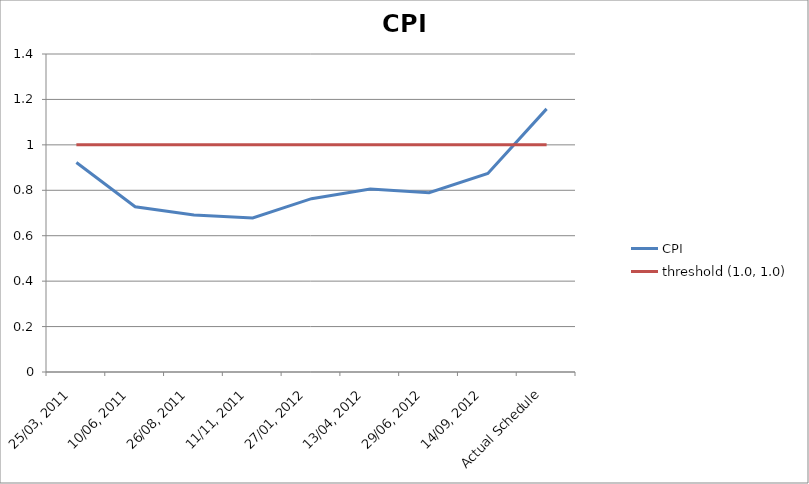
| Category | CPI | threshold (1.0, 1.0) |
|---|---|---|
| 25/03, 2011 | 0.922 | 1 |
| 10/06, 2011 | 0.728 | 1 |
| 26/08, 2011 | 0.691 | 1 |
| 11/11, 2011 | 0.678 | 1 |
| 27/01, 2012 | 0.763 | 1 |
| 13/04, 2012 | 0.805 | 1 |
| 29/06, 2012 | 0.789 | 1 |
| 14/09, 2012 | 0.874 | 1 |
| Actual Schedule | 1.158 | 1 |